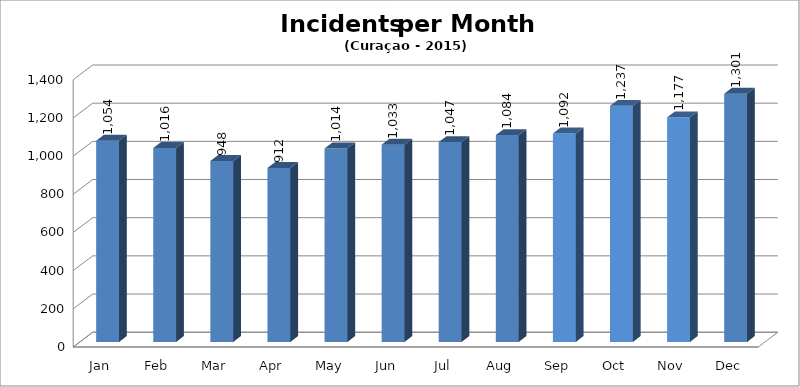
| Category | Series 0 |
|---|---|
| Jan | 1054 |
| Feb | 1016 |
| Mar | 948 |
| Apr | 912 |
| May | 1014 |
| Jun | 1033 |
| Jul | 1047 |
| Aug | 1084 |
| Sep | 1092 |
| Oct | 1237 |
| Nov | 1177 |
| Dec | 1301 |